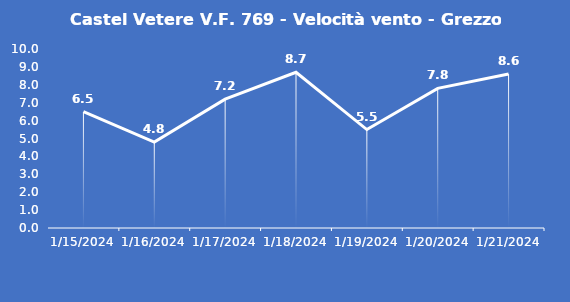
| Category | Castel Vetere V.F. 769 - Velocità vento - Grezzo (m/s) |
|---|---|
| 1/15/24 | 6.5 |
| 1/16/24 | 4.8 |
| 1/17/24 | 7.2 |
| 1/18/24 | 8.7 |
| 1/19/24 | 5.5 |
| 1/20/24 | 7.8 |
| 1/21/24 | 8.6 |